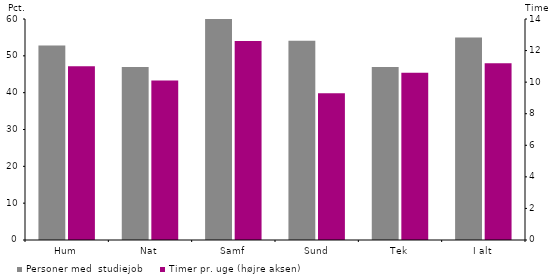
| Category | Personer med  studiejob | Formatering |
|---|---|---|
| Hum | 52.8 | 0 |
| Nat | 47 | 0 |
| Samf | 61.2 | 0 |
| Sund | 54.1 | 0 |
| Tek | 47 | 0 |
| I alt | 55 | 0 |